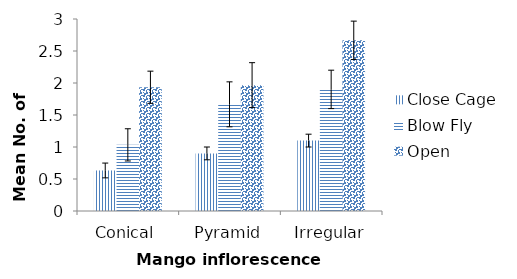
| Category | Close Cage | Blow Fly | Open |
|---|---|---|---|
| Conical | 0.633 | 1.033 | 1.933 |
| Pyramid | 0.9 | 1.667 | 1.967 |
| Irregular | 1.1 | 1.9 | 2.667 |